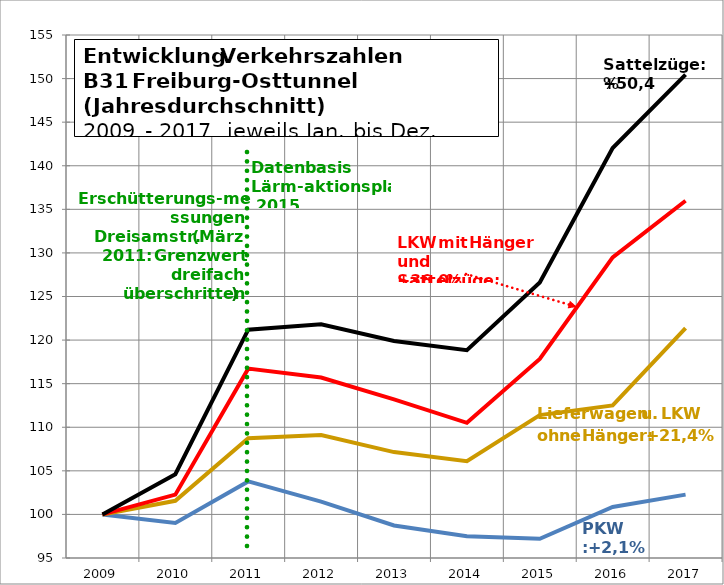
| Category | Series 0 | Series 1 | Series 2 | Sattel |
|---|---|---|---|---|
| 2009.0 | 100 | 100 | 100 | 100 |
| 2010.0 | 99.027 | 101.561 | 102.269 | 104.612 |
| 2011.0 | 103.787 | 108.752 | 116.725 | 121.191 |
| 2012.0 | 101.468 | 109.112 | 115.702 | 121.803 |
| 2013.0 | 98.737 | 107.148 | 113.194 | 119.896 |
| 2014.0 | 97.506 | 106.097 | 110.512 | 118.834 |
| 2015.0 | 97.202 | 111.396 | 117.838 | 126.608 |
| 2016.0 | 100.848 | 112.498 | 129.485 | 142.04 |
| 2017.0 | 102.27 | 121.383 | 135.984 | 150.45 |